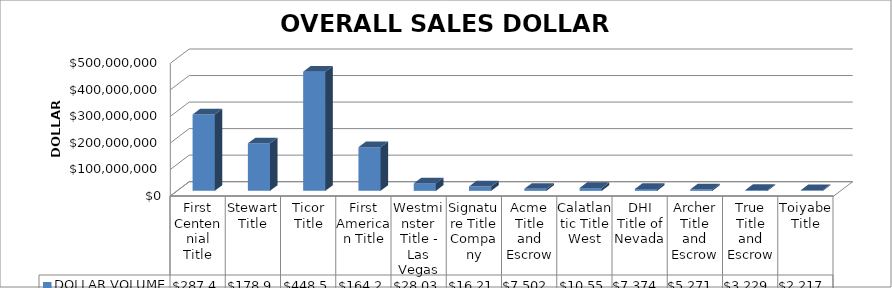
| Category | DOLLAR VOLUME |
|---|---|
| First Centennial Title | 287422044 |
| Stewart Title | 178972645.83 |
| Ticor Title | 448523164.6 |
| First American Title | 164245578 |
| Westminster Title - Las Vegas | 28032577 |
| Signature Title Company | 16216800 |
| Acme Title and Escrow | 7502500 |
| Calatlantic Title West | 10556939 |
| DHI Title of Nevada | 7374330 |
| Archer Title and Escrow | 5271000 |
| True Title and Escrow | 3229125 |
| Toiyabe Title | 2217000 |